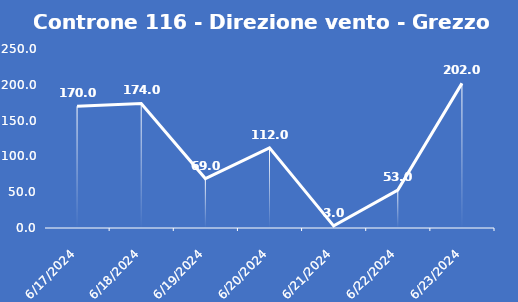
| Category | Controne 116 - Direzione vento - Grezzo (°N) |
|---|---|
| 6/17/24 | 170 |
| 6/18/24 | 174 |
| 6/19/24 | 69 |
| 6/20/24 | 112 |
| 6/21/24 | 3 |
| 6/22/24 | 53 |
| 6/23/24 | 202 |